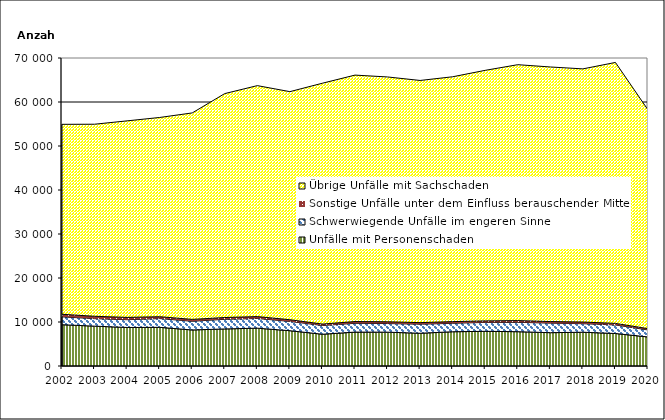
| Category | Unfälle mit Personenschaden | Schwerwiegende Unfälle im engeren Sinne | Sonstige Unfälle unter dem Einfluss berauschender Mittel 1) | Übrige Unfälle mit Sachschaden |
|---|---|---|---|---|
| 2002.0 | 9383 | 1782 | 592 | 43169 |
| 2003.0 | 9058 | 1702 | 542 | 43646 |
| 2004.0 | 8755 | 1770 | 513 | 44673 |
| 2005.0 | 8788 | 1991 | 422 | 45281 |
| 2006.0 | 8190 | 1977 | 424 | 46926 |
| 2007.0 | 8426 | 2186 | 404 | 50897 |
| 2008.0 | 8594 | 2206 | 432 | 52488 |
| 2009.0 | 8022 | 2115 | 380 | 51835 |
| 2010.0 | 7217 | 1987 | 324 | 54741 |
| 2011.0 | 7704 | 2003 | 394 | 56014 |
| 2012.0 | 7691 | 1958 | 401 | 55640 |
| 2013.0 | 7443 | 2059 | 355 | 55040 |
| 2014.0 | 7787 | 1921 | 380 | 55646 |
| 2015.0 | 7881 | 2030 | 341 | 56944 |
| 2016.0 | 7795 | 2138 | 392 | 58152 |
| 2017.0 | 7572 | 2169 | 356 | 57863 |
| 2018.0 | 7677 | 1941 | 377 | 57533 |
| 2019.0 | 7386 | 1946 | 351 | 59308 |
| 2020.0 | 6600 | 1591 | 293 | 49717 |